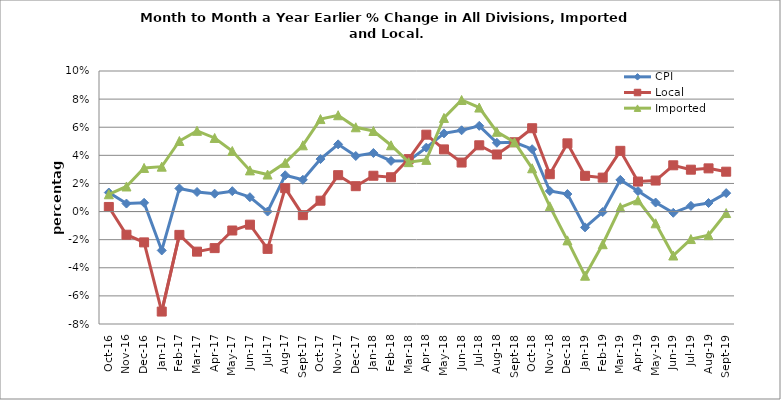
| Category | CPI | Local | Imported |
|---|---|---|---|
| 2016-10-01 | 0.014 | 0.003 | 0.012 |
| 2016-11-01 | 0.006 | -0.016 | 0.018 |
| 2016-12-01 | 0.006 | -0.022 | 0.031 |
| 2017-01-01 | -0.028 | -0.071 | 0.032 |
| 2017-02-01 | 0.016 | -0.017 | 0.05 |
| 2017-03-01 | 0.014 | -0.029 | 0.057 |
| 2017-04-01 | 0.013 | -0.026 | 0.052 |
| 2017-05-01 | 0.015 | -0.013 | 0.043 |
| 2017-06-01 | 0.01 | -0.009 | 0.029 |
| 2017-07-01 | 0 | -0.027 | 0.026 |
| 2017-08-01 | 0.026 | 0.017 | 0.035 |
| 2017-09-01 | 0.023 | -0.003 | 0.047 |
| 2017-10-01 | 0.037 | 0.008 | 0.066 |
| 2017-11-01 | 0.048 | 0.026 | 0.069 |
| 2017-12-01 | 0.04 | 0.018 | 0.06 |
| 2018-01-01 | 0.042 | 0.025 | 0.057 |
| 2018-02-01 | 0.036 | 0.024 | 0.047 |
| 2018-03-01 | 0.036 | 0.037 | 0.035 |
| 2018-04-01 | 0.045 | 0.055 | 0.037 |
| 2018-05-01 | 0.056 | 0.044 | 0.067 |
| 2018-06-01 | 0.058 | 0.035 | 0.079 |
| 2018-07-01 | 0.061 | 0.047 | 0.074 |
| 2018-08-01 | 0.049 | 0.041 | 0.057 |
| 2018-09-01 | 0.049 | 0.049 | 0.049 |
| 2018-10-01 | 0.044 | 0.059 | 0.031 |
| 2018-11-01 | 0.015 | 0.027 | 0.004 |
| 2018-12-01 | 0.012 | 0.049 | -0.021 |
| 2019-01-01 | -0.011 | 0.025 | -0.046 |
| 2019-02-01 | 0 | 0.024 | -0.023 |
| 2019-03-01 | 0.023 | 0.043 | 0.003 |
| 2019-04-01 | 0.015 | 0.021 | 0.008 |
| 2019-05-01 | 0.006 | 0.022 | -0.008 |
| 2019-06-01 | -0.001 | 0.033 | -0.031 |
| 2019-07-01 | 0.004 | 0.03 | -0.02 |
| 2019-08-01 | 0.006 | 0.031 | -0.017 |
| 2019-09-01 | 0.013 | 0.028 | -0.001 |